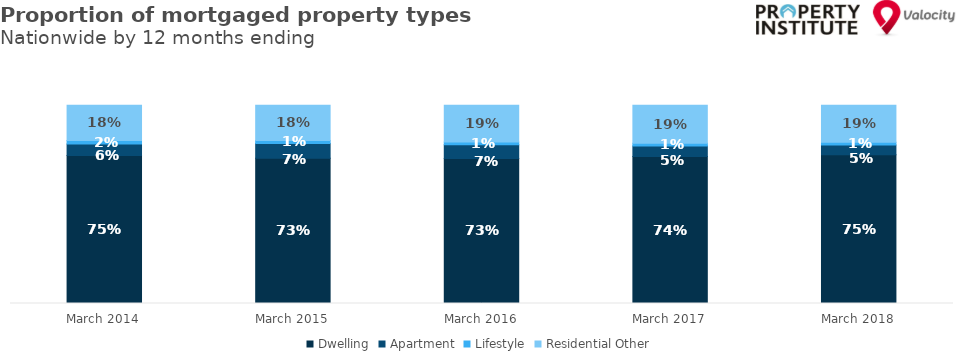
| Category | Dwelling | Apartment | Lifestyle | Residential Other |
|---|---|---|---|---|
| 2014-03-01 | 0.746 | 0.057 | 0.018 | 0.178 |
| 2015-03-01 | 0.732 | 0.075 | 0.015 | 0.178 |
| 2016-03-01 | 0.731 | 0.07 | 0.014 | 0.185 |
| 2017-03-01 | 0.741 | 0.053 | 0.014 | 0.192 |
| 2018-03-01 | 0.751 | 0.049 | 0.014 | 0.187 |